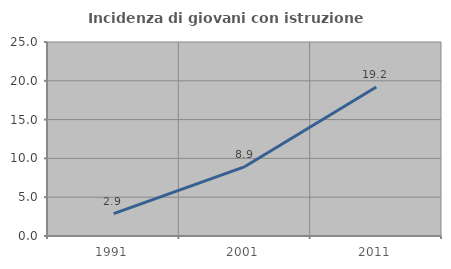
| Category | Incidenza di giovani con istruzione universitaria |
|---|---|
| 1991.0 | 2.888 |
| 2001.0 | 8.946 |
| 2011.0 | 19.192 |